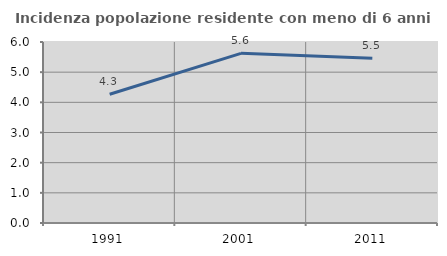
| Category | Incidenza popolazione residente con meno di 6 anni |
|---|---|
| 1991.0 | 4.268 |
| 2001.0 | 5.623 |
| 2011.0 | 5.46 |